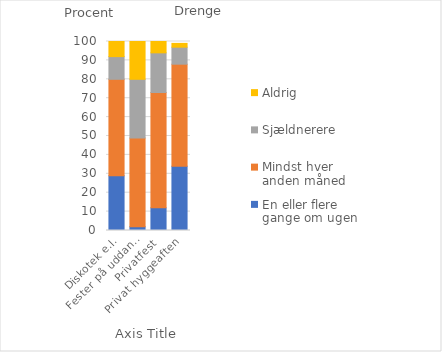
| Category | En eller flere gange om ugen | Mindst hver anden måned | Sjældnerere | Aldrig |
|---|---|---|---|---|
| Diskotek e.l. | 29 | 51 | 12 | 8 |
| Fester på uddannelsessted | 2 | 47 | 31 | 20 |
| Privatfest | 12 | 61 | 21 | 6 |
| Privat hyggeaften | 34 | 54 | 9 | 2 |